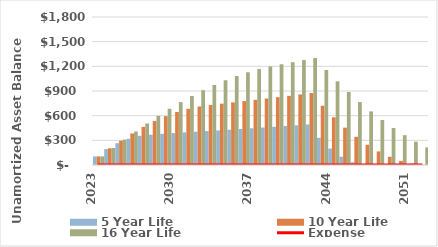
| Category | 5 Year Life | 10 Year Life | 16 Year Life |
|---|---|---|---|
| 2023.0 | 104.561 | 104.561 | 104.561 |
| 2024.0 | 193.033 | 203.489 | 207.41 |
| 2025.0 | 264.685 | 296.535 | 308.479 |
| 2026.0 | 318.749 | 383.438 | 407.697 |
| 2027.0 | 354.422 | 463.924 | 504.988 |
| 2028.0 | 367.542 | 534.387 | 596.953 |
| 2029.0 | 378.569 | 594.624 | 683.487 |
| 2030.0 | 388.008 | 644.433 | 764.481 |
| 2031.0 | 396.4 | 683.605 | 839.824 |
| 2032.0 | 404.328 | 711.926 | 909.402 |
| 2033.0 | 412.415 | 729.18 | 973.101 |
| 2034.0 | 420.663 | 745.602 | 1030.803 |
| 2035.0 | 429.077 | 761.448 | 1082.388 |
| 2036.0 | 437.658 | 776.993 | 1127.733 |
| 2037.0 | 446.411 | 792.533 | 1166.715 |
| 2038.0 | 455.339 | 808.383 | 1199.205 |
| 2039.0 | 464.446 | 824.551 | 1225.073 |
| 2040.0 | 473.735 | 841.042 | 1250.724 |
| 2041.0 | 483.21 | 857.863 | 1276.322 |
| 2042.0 | 492.874 | 875.02 | 1302.046 |
| 2043.0 | 330.723 | 720.512 | 1156.078 |
| 2044.0 | 199.731 | 580.115 | 1017.942 |
| 2045.0 | 100.52 | 454.11 | 887.793 |
| 2046.0 | 33.727 | 342.786 | 765.792 |
| 2047.0 | 0 | 246.437 | 652.101 |
| 2048.0 | 0 | 165.362 | 546.888 |
| 2049.0 | 0 | 99.865 | 450.32 |
| 2050.0 | 0 | 50.26 | 362.572 |
| 2051.0 | 0 | 16.864 | 283.819 |
| 2052.0 | 0 | 0 | 214.242 |